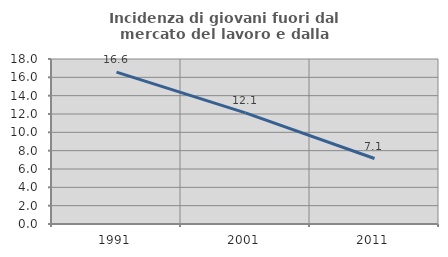
| Category | Incidenza di giovani fuori dal mercato del lavoro e dalla formazione  |
|---|---|
| 1991.0 | 16.568 |
| 2001.0 | 12.121 |
| 2011.0 | 7.143 |